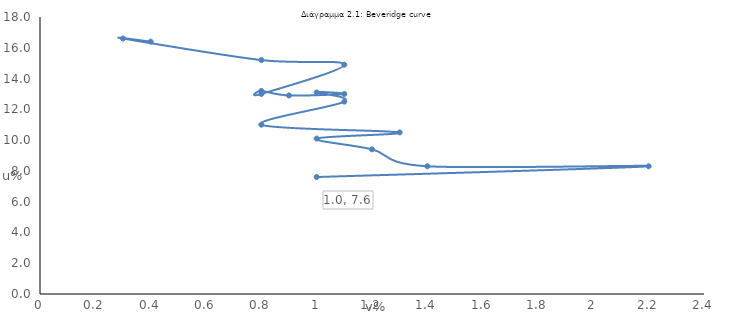
| Category | % ανεργίας |
|---|---|
| 0.4 | 16.4 |
| 0.3 | 16.6 |
| 0.8 | 15.2 |
| 1.1 | 14.9 |
| 0.8 | 13 |
| 0.8 | 13.2 |
| 0.9 | 12.9 |
| 1.1 | 13 |
| 1.0 | 13.1 |
| 1.1 | 12.5 |
| 0.8 | 11 |
| 1.3 | 10.5 |
| 1.0 | 10.1 |
| 1.2 | 9.4 |
| 1.4 | 8.3 |
| 2.2 | 8.3 |
| 1.0 | 7.6 |